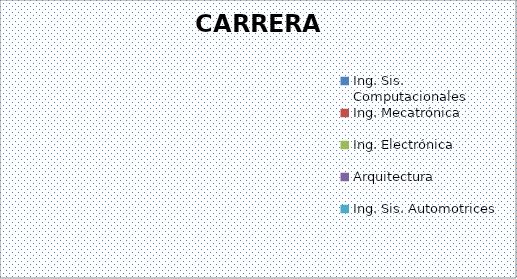
| Category | Ing. Sis. Computacionales |
|---|---|
| Ing. Sis. Computacionales | 0 |
| Ing. Mecatrónica | 0 |
| Ing. Electrónica | 0 |
| Arquitectura | 0 |
| Ing. Sis. Automotrices | 0 |